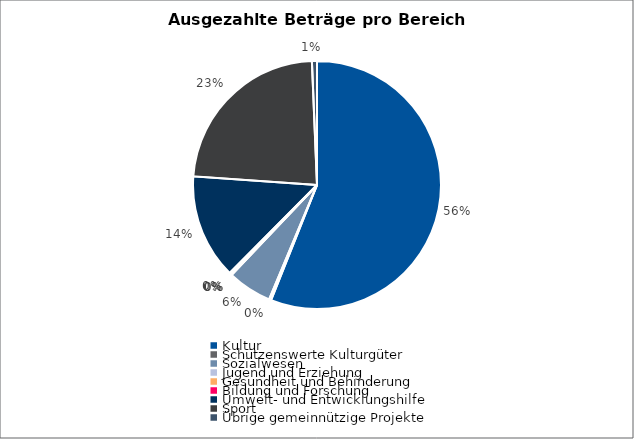
| Category | Series 0 |
|---|---|
| Kultur | 20500000 |
| Schützenswerte Kulturgüter | 100000 |
| Sozialwesen | 2111000 |
| Jugend und Erziehung | 10000 |
| Gesundheit und Behinderung | 30000 |
| Bildung und Forschung | 90000 |
| Umwelt- und Entwicklungshilfe | 5000000 |
| Sport | 8500000 |
| Übrige gemeinnützige Projekte | 240000 |